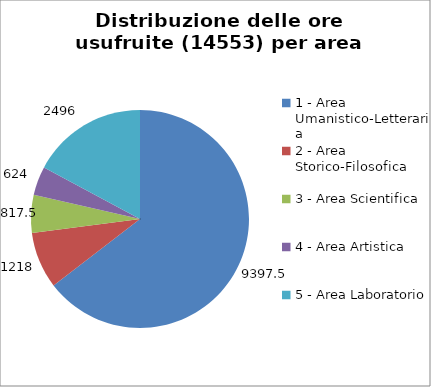
| Category | Nr. Ore Usufruite |
|---|---|
| 1 - Area Umanistico-Letteraria | 9397.5 |
| 2 - Area Storico-Filosofica | 1218 |
| 3 - Area Scientifica | 817.5 |
| 4 - Area Artistica | 624 |
| 5 - Area Laboratorio | 2496 |